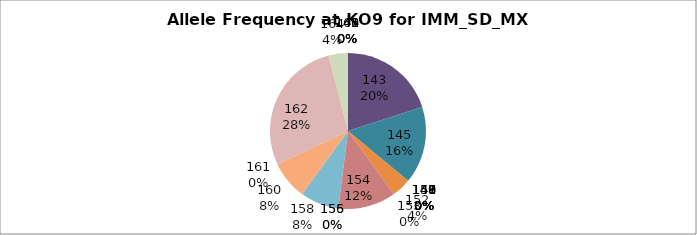
| Category | Series 0 |
|---|---|
| 140.0 | 0 |
| 141.0 | 0 |
| 142.0 | 0 |
| 143.0 | 0.2 |
| 145.0 | 0.16 |
| 146.0 | 0 |
| 147.0 | 0 |
| 148.0 | 0 |
| 149.0 | 0 |
| 150.0 | 0 |
| 151.0 | 0 |
| 152.0 | 0.04 |
| 153.0 | 0 |
| 154.0 | 0.12 |
| 155.0 | 0 |
| 156.0 | 0 |
| 158.0 | 0.08 |
| 160.0 | 0.08 |
| 161.0 | 0 |
| 162.0 | 0.28 |
| 164.0 | 0.04 |
| 166.0 | 0 |